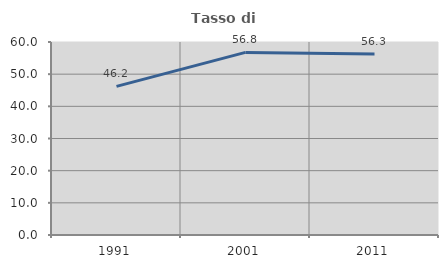
| Category | Tasso di occupazione   |
|---|---|
| 1991.0 | 46.205 |
| 2001.0 | 56.768 |
| 2011.0 | 56.276 |